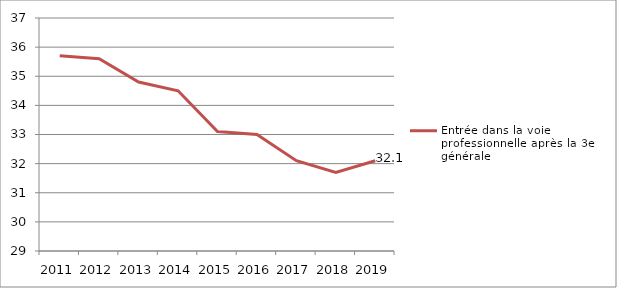
| Category | Entrée dans la voie professionnelle après la 3e générale |
|---|---|
| 2011.0 | 35.7 |
| 2012.0 | 35.6 |
| 2013.0 | 34.8 |
| 2014.0 | 34.5 |
| 2015.0 | 33.1 |
| 2016.0 | 33 |
| 2017.0 | 32.1 |
| 2018.0 | 31.7 |
| 2019.0 | 32.1 |